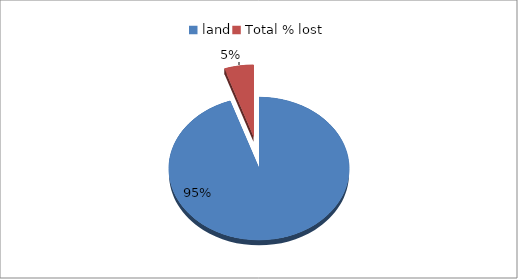
| Category | Series 0 |
|---|---|
| land | 100 |
| Total % lost | 5.5 |